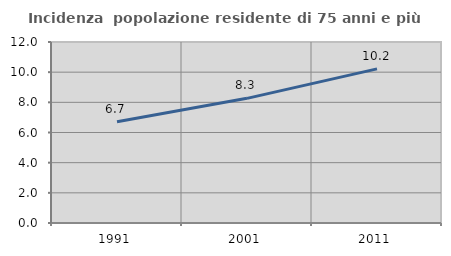
| Category | Incidenza  popolazione residente di 75 anni e più |
|---|---|
| 1991.0 | 6.715 |
| 2001.0 | 8.265 |
| 2011.0 | 10.219 |